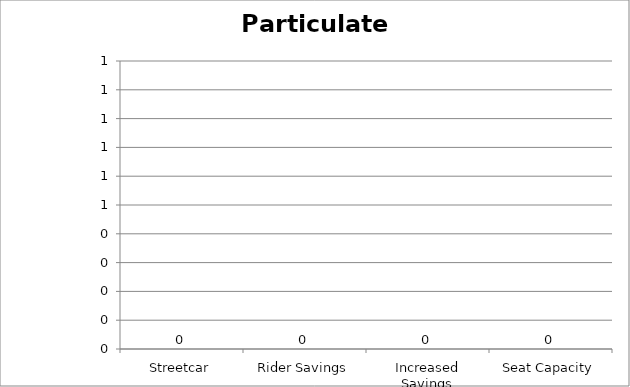
| Category | Particulate Matter |
|---|---|
| Streetcar | 0 |
| Rider Savings | 0 |
| Increased Savings | 0 |
| Seat Capacity | 0 |